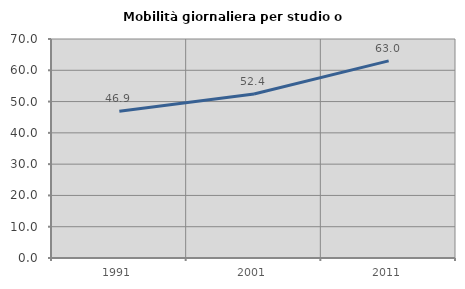
| Category | Mobilità giornaliera per studio o lavoro |
|---|---|
| 1991.0 | 46.929 |
| 2001.0 | 52.412 |
| 2011.0 | 63.011 |